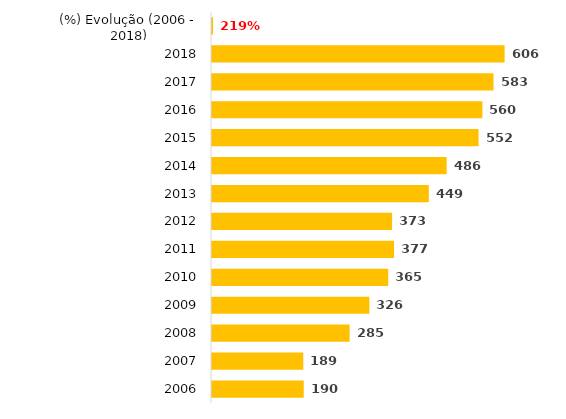
| Category | Total Geral |
|---|---|
| 2006 | 190 |
| 2007 | 189 |
| 2008 | 285 |
| 2009 | 326 |
| 2010 | 365 |
| 2011 | 377 |
| 2012 | 373 |
| 2013 | 449 |
| 2014 | 486 |
| 2015 | 552 |
| 2016 | 560 |
| 2017 | 583 |
| 2018 | 606 |
| (%) Evolução (2006 - 2018) | 2.189 |